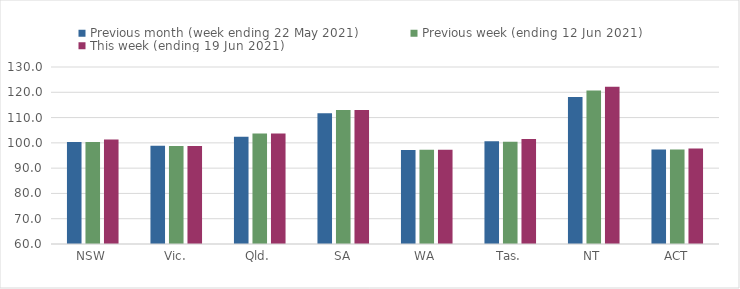
| Category | Previous month (week ending 22 May 2021) | Previous week (ending 12 Jun 2021) | This week (ending 19 Jun 2021) |
|---|---|---|---|
| NSW | 100.29 | 100.35 | 101.35 |
| Vic. | 98.84 | 98.79 | 98.79 |
| Qld. | 102.37 | 103.7 | 103.7 |
| SA | 111.74 | 112.95 | 112.95 |
| WA | 97.17 | 97.25 | 97.25 |
| Tas. | 100.63 | 100.39 | 101.48 |
| NT | 118.1 | 120.67 | 122.16 |
| ACT | 97.35 | 97.4 | 97.78 |